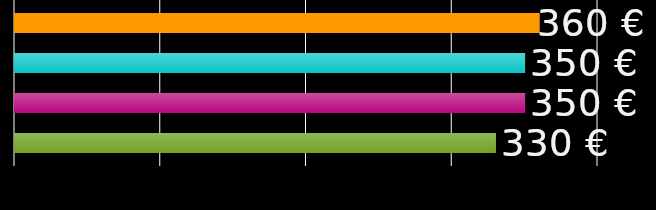
| Category | kämppäkaveri 1 | kämppäkaveri 2 | kämppäkaveri 3 | kämppäkaveri 4 |
|---|---|---|---|---|
| 0 | 360 | 350 | 350 | 330 |